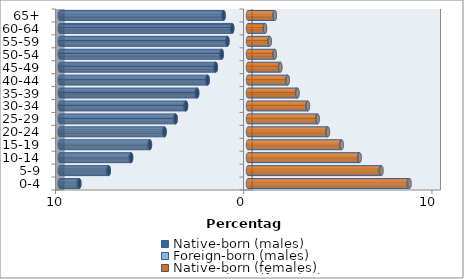
| Category | Native-born (males) | Foreign-born (males) | Native-born (females) | Foreign-born (females) |
|---|---|---|---|---|
| 0-4 | -8.959 | -0.047 | 8.537 | 0.051 |
| 5-9 | -7.398 | -0.039 | 7.052 | 0.044 |
| 10-14 | -6.21 | -0.032 | 5.9 | 0.036 |
| 15-19 | -5.209 | -0.028 | 4.948 | 0.032 |
| 20-24 | -4.432 | -0.027 | 4.222 | 0.028 |
| 25-29 | -3.845 | -0.03 | 3.675 | 0.028 |
| 30-34 | -3.293 | -0.033 | 3.159 | 0.026 |
| 35-39 | -2.7 | -0.036 | 2.61 | 0.023 |
| 40-44 | -2.142 | -0.033 | 2.096 | 0.018 |
| 45-49 | -1.708 | -0.027 | 1.705 | 0.014 |
| 50-54 | -1.393 | -0.02 | 1.416 | 0.01 |
| 55-59 | -1.091 | -0.015 | 1.144 | 0.008 |
| 60-64 | -0.839 | -0.009 | 0.897 | 0.005 |
| 65+ | -1.294 | -0.008 | 1.416 | 0.006 |